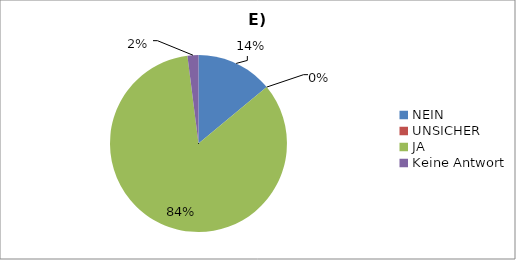
| Category | Series 0 |
|---|---|
| NEIN | 14 |
| UNSICHER | 0 |
| JA | 84 |
| Keine Antwort | 2 |